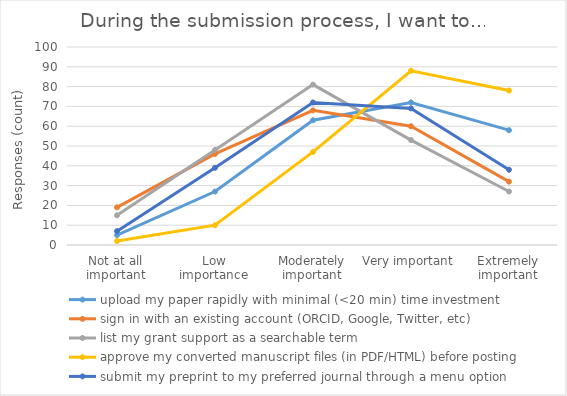
| Category | upload my paper rapidly with minimal (<20 min) time investment | sign in with an existing account (ORCID, Google, Twitter, etc) | list my grant support as a searchable term | approve my converted manuscript files (in PDF/HTML) before posting | submit my preprint to my preferred journal through a menu option |
|---|---|---|---|---|---|
| Not at all important | 5 | 19 | 15 | 2 | 7 |
| Low importance | 27 | 46 | 48 | 10 | 39 |
| Moderately important | 63 | 68 | 81 | 47 | 72 |
| Very important | 72 | 60 | 53 | 88 | 69 |
| Extremely important | 58 | 32 | 27 | 78 | 38 |